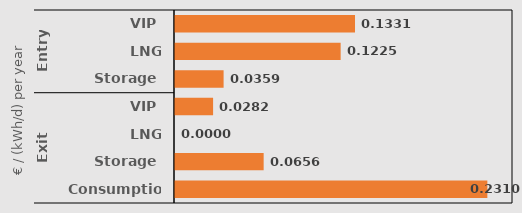
| Category | Series 0 |
|---|---|
| 0 | 0.133 |
| 1 | 0.123 |
| 2 | 0.036 |
| 3 | 0.028 |
| 4 | 0 |
| 5 | 0.066 |
| 6 | 0.231 |